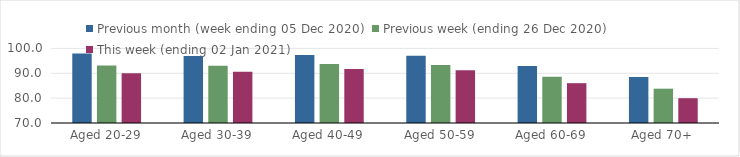
| Category | Previous month (week ending 05 Dec 2020) | Previous week (ending 26 Dec 2020) | This week (ending 02 Jan 2021) |
|---|---|---|---|
| Aged 20-29 | 98 | 93.17 | 89.98 |
| Aged 30-39 | 96.99 | 93.03 | 90.64 |
| Aged 40-49 | 97.39 | 93.75 | 91.71 |
| Aged 50-59 | 97.1 | 93.37 | 91.25 |
| Aged 60-69 | 92.9 | 88.6 | 86.02 |
| Aged 70+ | 88.46 | 83.8 | 79.97 |